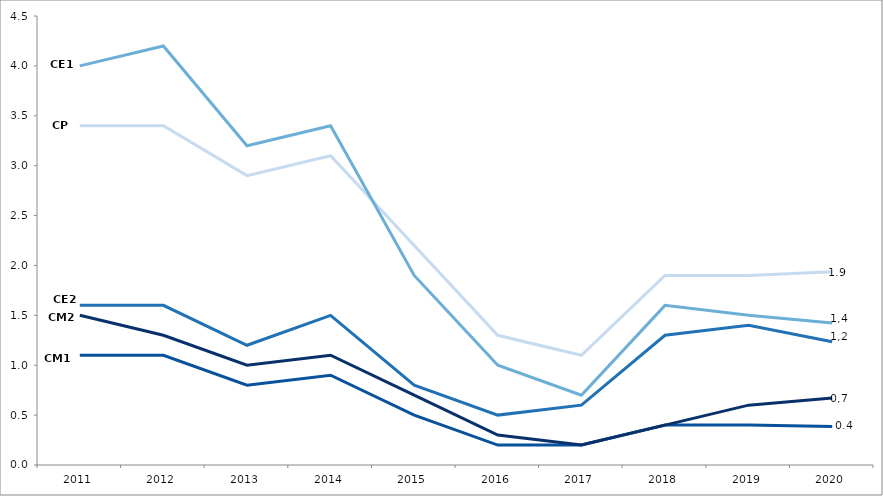
| Category | CP | CE1 | CE2 | CM1 | CM2 |
|---|---|---|---|---|---|
| 2011.0 | 3.4 | 4 | 1.6 | 1.1 | 1.5 |
| 2012.0 | 3.4 | 4.2 | 1.6 | 1.1 | 1.3 |
| 2013.0 | 2.9 | 3.2 | 1.2 | 0.8 | 1 |
| 2014.0 | 3.1 | 3.4 | 1.5 | 0.9 | 1.1 |
| 2015.0 | 2.2 | 1.9 | 0.8 | 0.5 | 0.7 |
| 2016.0 | 1.3 | 1 | 0.5 | 0.2 | 0.3 |
| 2017.0 | 1.1 | 0.7 | 0.6 | 0.2 | 0.2 |
| 2018.0 | 1.9 | 1.6 | 1.3 | 0.4 | 0.4 |
| 2019.0 | 1.9 | 1.5 | 1.4 | 0.4 | 0.6 |
| 2020.0 | 1.937 | 1.422 | 1.236 | 0.386 | 0.672 |